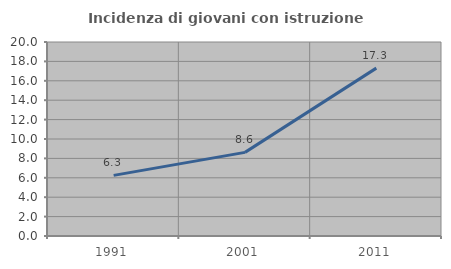
| Category | Incidenza di giovani con istruzione universitaria |
|---|---|
| 1991.0 | 6.25 |
| 2001.0 | 8.621 |
| 2011.0 | 17.308 |